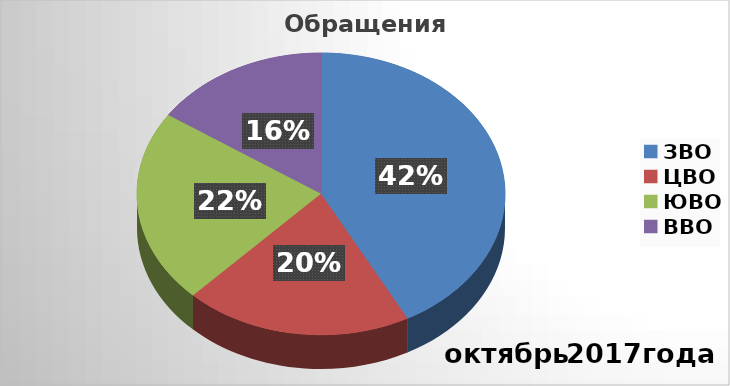
| Category | Series 0 |
|---|---|
| ЗВО | 19 |
| ЦВО | 9 |
| ЮВО | 10 |
| ВВО | 7 |